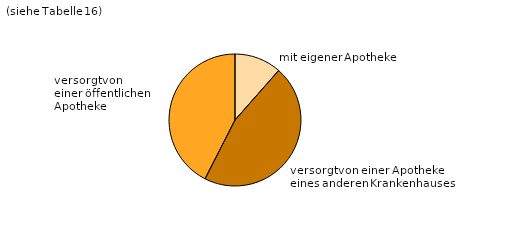
| Category | Series 0 |
|---|---|
| mit eigener Apotheke  | 11.5 |
| versorgt von einer Apotheke
eines anderen Krankenhauses . | 46 |
| versorgt von einer öffentlichen Apotheke ……………………… | 42.5 |